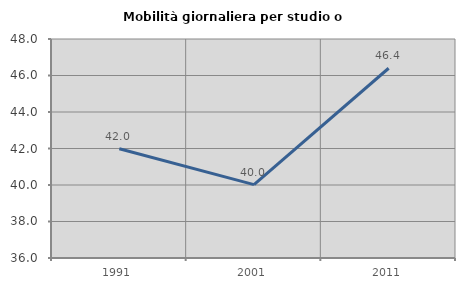
| Category | Mobilità giornaliera per studio o lavoro |
|---|---|
| 1991.0 | 41.985 |
| 2001.0 | 40.021 |
| 2011.0 | 46.397 |